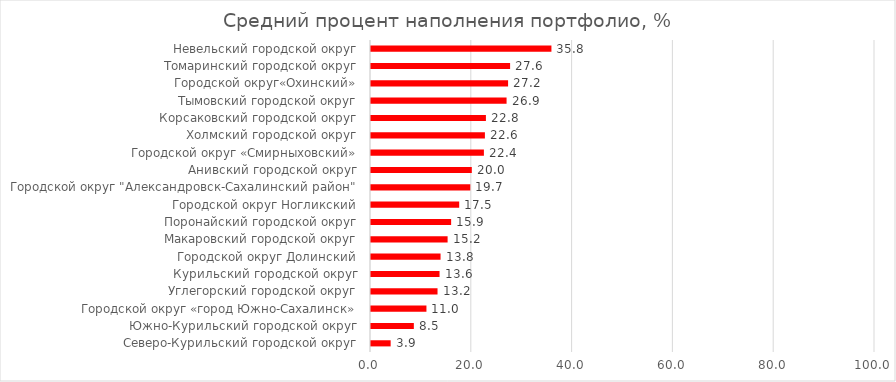
| Category | Средний процент наполнения портфолио, % |
|---|---|
| Северо-Курильский городской округ | 3.9 |
| Южно-Курильский городской округ | 8.5 |
| Городской округ «город Южно-Сахалинск» | 11 |
| Углегорский городской округ | 13.2 |
| Курильский городской округ | 13.6 |
| Городской округ Долинский | 13.8 |
| Макаровский городской округ | 15.2 |
| Поронайский городской округ | 15.9 |
| Городской округ Ногликский | 17.5 |
| Городской округ "Александровск-Сахалинский район" | 19.7 |
| Анивский городской округ | 20 |
| Городской округ «Смирныховский» | 22.4 |
| Холмский городской округ | 22.6 |
| Корсаковский городской округ | 22.8 |
| Тымовский городской округ | 26.9 |
| Городской округ«Охинский» | 27.2 |
| Томаринский городской округ | 27.6 |
| Невельский городской округ | 35.8 |